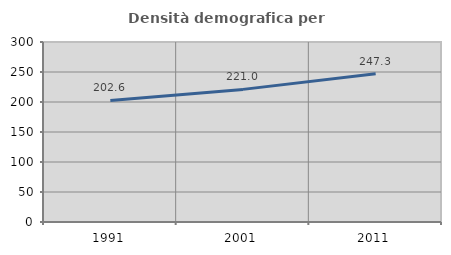
| Category | Densità demografica |
|---|---|
| 1991.0 | 202.613 |
| 2001.0 | 221.027 |
| 2011.0 | 247.267 |